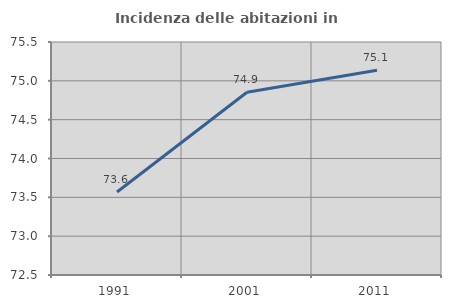
| Category | Incidenza delle abitazioni in proprietà  |
|---|---|
| 1991.0 | 73.569 |
| 2001.0 | 74.852 |
| 2011.0 | 75.136 |